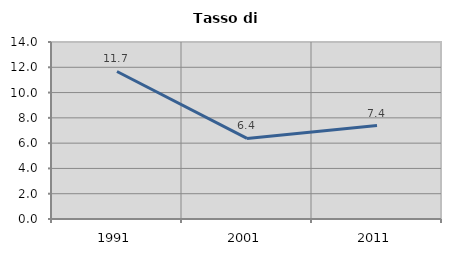
| Category | Tasso di disoccupazione   |
|---|---|
| 1991.0 | 11.669 |
| 2001.0 | 6.372 |
| 2011.0 | 7.387 |